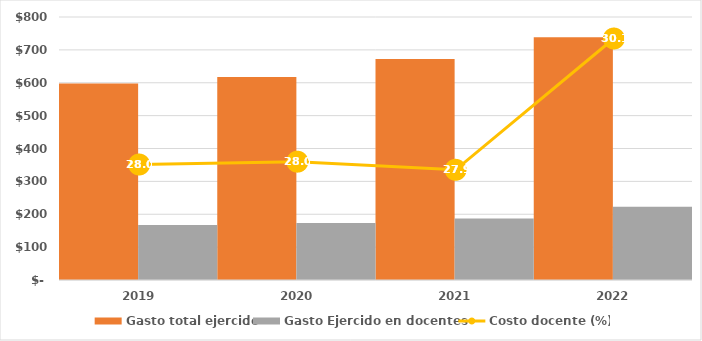
| Category | Gasto total ejercido | Gasto Ejercido en docentes |
|---|---|---|
| 2019 | 598040.902 | 167308.478 |
| 2020 | 617347.742 | 173008.939 |
| 2021 | 672172.234 | 187436.524 |
| 2022 | 738205.545 | 222435.731 |